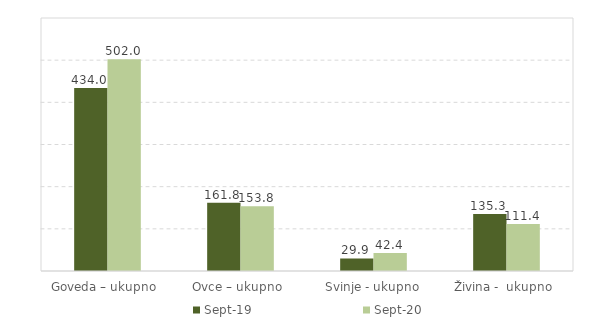
| Category | Sep-19 | Sep-20 |
|---|---|---|
| Goveda – ukupno  | 434 | 502 |
| Ovce – ukupno  | 161.8 | 153.8 |
| Svinje - ukupno | 29.9 | 42.4 |
| Živina -  ukupno  | 135.3 | 111.4 |